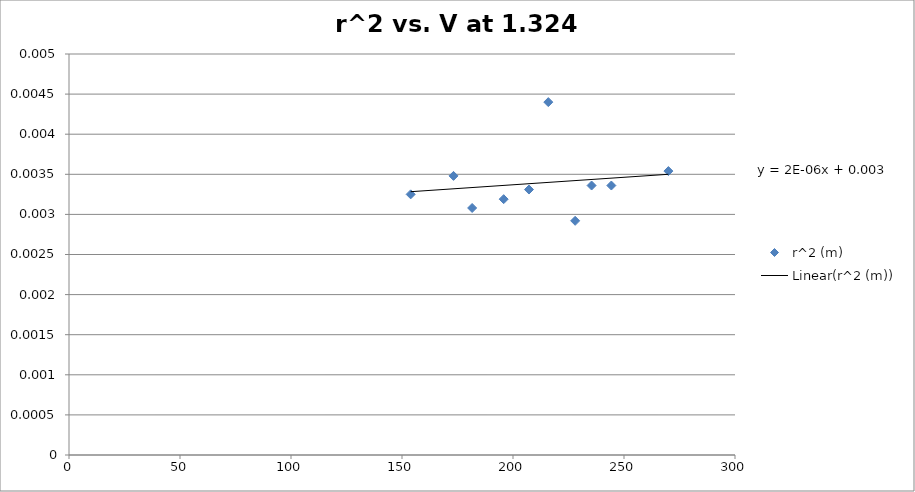
| Category | r^2 (m) |
|---|---|
| 270.0 | 0.004 |
| 244.3 | 0.003 |
| 235.4 | 0.003 |
| 228.0 | 0.003 |
| 215.9 | 0.004 |
| 207.2 | 0.003 |
| 195.8 | 0.003 |
| 181.6 | 0.003 |
| 173.2 | 0.003 |
| 153.9 | 0.003 |